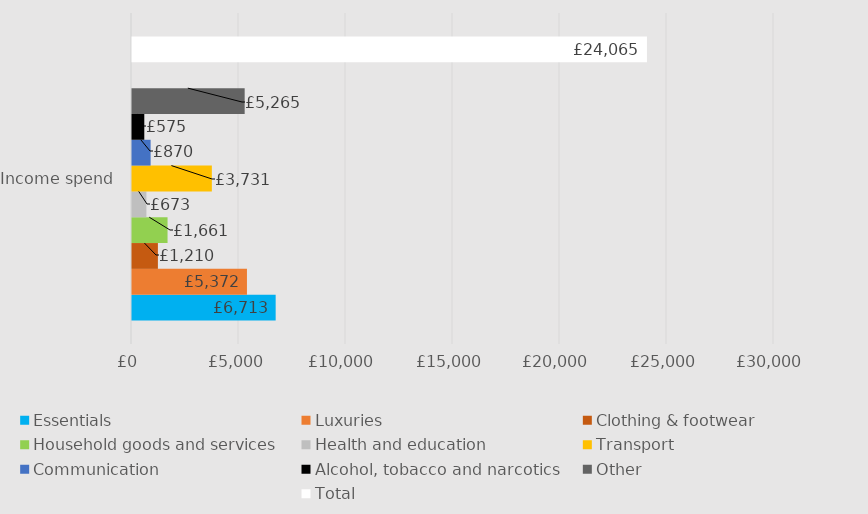
| Category | Essentials | Luxuries | Clothing & footwear | Household goods and services | Health and education | Transport | Communication | Alcohol, tobacco and narcotics | Other | Series 9 | Total |
|---|---|---|---|---|---|---|---|---|---|---|---|
| Income spend | 6713.2 | 5371.6 | 1210.3 | 1661.4 | 673.4 | 3731 | 869.7 | 574.6 | 5265 |  | 24064.8 |